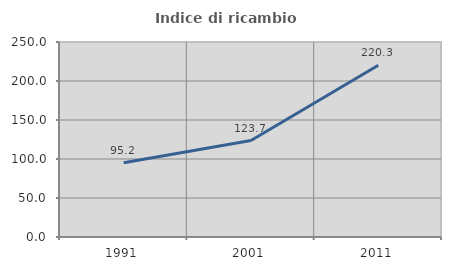
| Category | Indice di ricambio occupazionale  |
|---|---|
| 1991.0 | 95.181 |
| 2001.0 | 123.694 |
| 2011.0 | 220.263 |